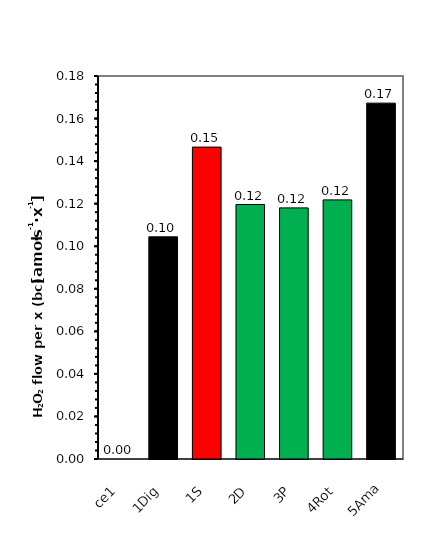
| Category | Series 0 |
|---|---|
| ce1 | 0 |
| 1Dig | 0.104 |
| 1S | 0.147 |
| 2D | 0.12 |
| 3P | 0.118 |
| 4Rot | 0.122 |
| 5Ama | 0.167 |